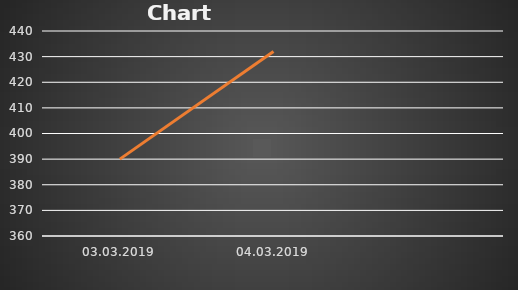
| Category | Series 1 |
|---|---|
| 03.03.2019 | 390 |
| 04.03.2019 | 432 |